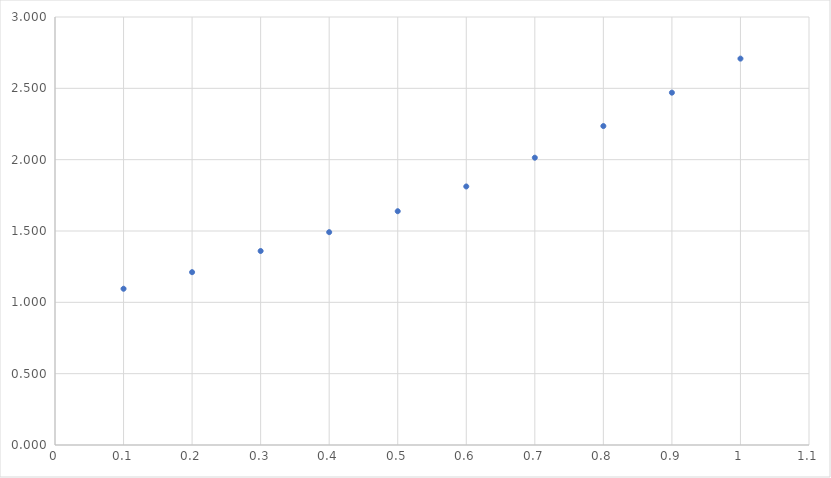
| Category | y |
|---|---|
| 0.1 | 1.095 |
| 0.2 | 1.211 |
| 0.30000000000000004 | 1.36 |
| 0.4 | 1.492 |
| 0.5 | 1.639 |
| 0.6 | 1.812 |
| 0.7 | 2.014 |
| 0.7999999999999999 | 2.236 |
| 0.8999999999999999 | 2.47 |
| 0.9999999999999999 | 2.708 |